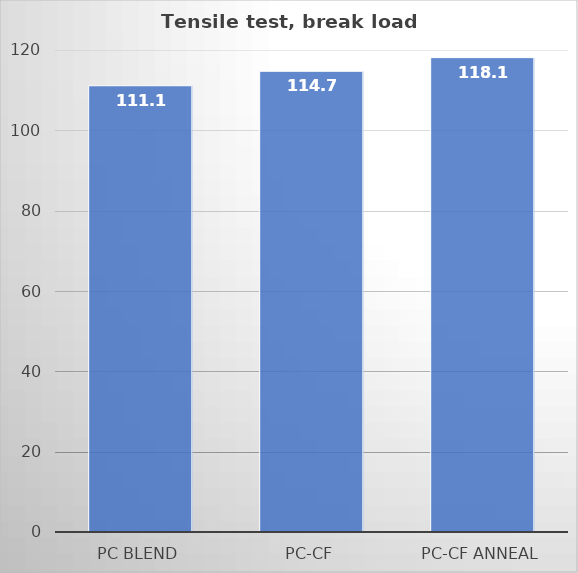
| Category | Average (kg) |
|---|---|
| PC blend | 111.1 |
| PC-CF | 114.7 |
| PC-CF anneal | 118.1 |